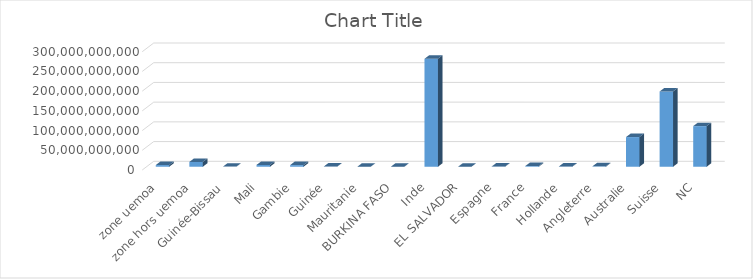
| Category | Series 0 |
|---|---|
| zone uemoa | 4318209150 |
| zone hors uemoa | 12220038200 |
| Guinée-Bissau | 317744040 |
| Mali | 4601004405 |
| Gambie | 4206761179.61 |
| Guinée | 412051625 |
| Mauritanie | 78170125 |
| BURKINA FASO | 136876700 |
| Inde | 273780001009.51 |
| EL SALVADOR | 58098538 |
| Espagne | 621479819 |
| France | 1663999836.771 |
| Hollande | 667908062.95 |
| Angleterre | 1111026276.08 |
| Australie | 75234797242.328 |
| Suisse | 190797832540.137 |
| NC | 103019420087.077 |